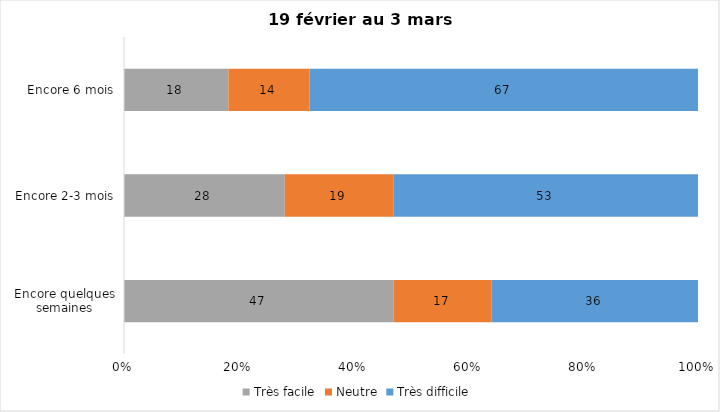
| Category | Très facile | Neutre | Très difficile |
|---|---|---|---|
| Encore quelques semaines | 47 | 17 | 36 |
| Encore 2-3 mois | 28 | 19 | 53 |
| Encore 6 mois | 18 | 14 | 67 |